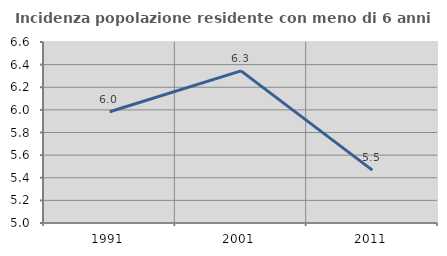
| Category | Incidenza popolazione residente con meno di 6 anni |
|---|---|
| 1991.0 | 5.983 |
| 2001.0 | 6.345 |
| 2011.0 | 5.467 |